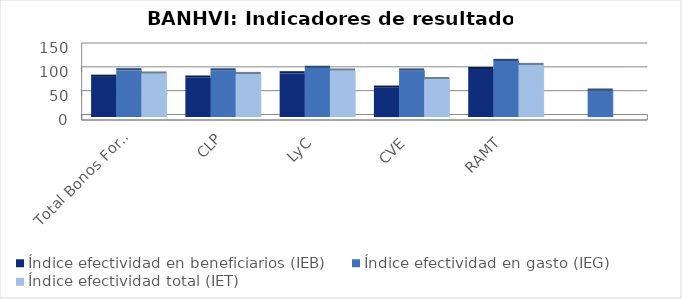
| Category | Índice efectividad en beneficiarios (IEB) | Índice efectividad en gasto (IEG)  | Índice efectividad total (IET) |
|---|---|---|---|
| Total Bonos Formalizados | 84.424 | 97.98 | 91.202 |
| CLP | 82.651 | 97.752 | 90.201 |
| LyC | 91.654 | 103.143 | 97.398 |
| CVE | 61.583 | 97.419 | 79.501 |
| RAMT | 100.615 | 117.64 | 109.128 |